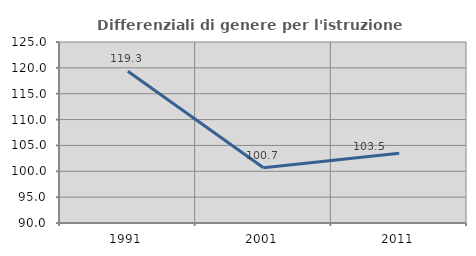
| Category | Differenziali di genere per l'istruzione superiore |
|---|---|
| 1991.0 | 119.349 |
| 2001.0 | 100.69 |
| 2011.0 | 103.469 |